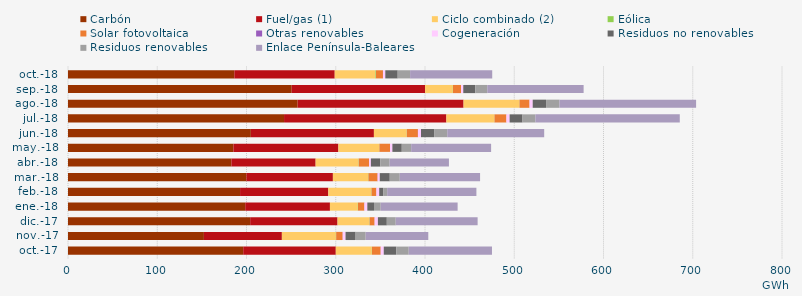
| Category | Carbón | Fuel/gas (1) | Ciclo combinado (2) | Eólica | Solar fotovoltaica | Otras renovables | Cogeneración | Residuos no renovables | Residuos renovables | Enlace Península-Baleares |
|---|---|---|---|---|---|---|---|---|---|---|
| oct.-17 | 196.317 | 103.725 | 40.38 | 0.195 | 9.719 | 0.106 | 3.35 | 13.983 | 13.983 | 93.286 |
| nov.-17 | 152.282 | 87.352 | 60.509 | 0.343 | 7.258 | 0.127 | 3.099 | 11.279 | 11.279 | 70.162 |
| dic.-17 | 204.111 | 97.886 | 35.554 | 0.382 | 5.557 | 0.137 | 3.6 | 9.982 | 9.982 | 91.767 |
| ene.-18 | 198.555 | 94.932 | 31.201 | 0.253 | 7.038 | 0.219 | 3.183 | 7.481 | 7.481 | 86.204 |
| feb.-18 | 192.795 | 98.852 | 48.135 | 0.324 | 5.33 | 0.166 | 3.084 | 4.456 | 4.456 | 99.993 |
| mar.-18 | 199.822 | 96.98 | 39.439 | 0.406 | 10.194 | 0.184 | 2.295 | 11.2 | 11.2 | 89.997 |
| abr.-18 | 183.056 | 94.399 | 48.047 | 0.283 | 11.477 | 0.131 | 1.982 | 10.487 | 10.487 | 66.468 |
| may.-18 | 185.328 | 117.635 | 45.725 | 0.229 | 11.839 | 0.128 | 2.579 | 10.525 | 10.525 | 89.565 |
| jun.-18 | 204.88 | 137.881 | 36.755 | 0.139 | 12.383 | 0.11 | 3.357 | 14.709 | 14.709 | 108.624 |
| jul.-18 | 242.068 | 181.893 | 53.755 | 0.139 | 13.342 | 0.058 | 3.566 | 14.429 | 14.429 | 161.792 |
| ago.-18 | 257.313 | 185.888 | 62.466 | 0.192 | 11.262 | 0.057 | 3.515 | 14.961 | 14.961 | 153.134 |
| sep.-18 | 250.63 | 149.447 | 31.105 | 0.198 | 9.046 | 0.019 | 2.437 | 13.454 | 13.454 | 107.931 |
| oct.-18 | 186.346 | 112.508 | 45.569 | 0.62 | 7.841 | 0.06 | 2.572 | 13.898 | 13.898 | 92.008 |